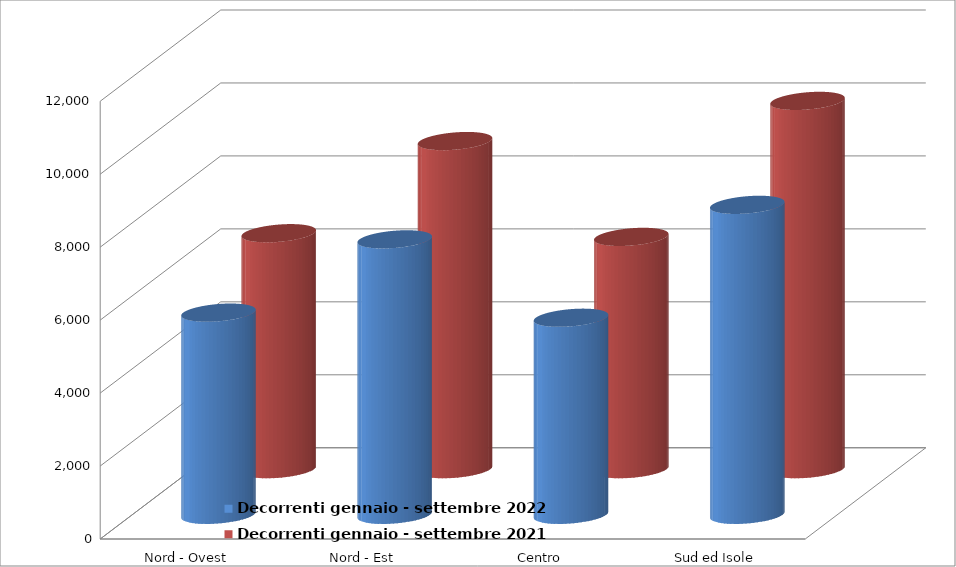
| Category | Decorrenti gennaio - settembre 2022 | Decorrenti gennaio - settembre 2021 |
|---|---|---|
| Nord - Ovest | 5542 | 6469 |
| Nord - Est | 7551 | 8995 |
| Centro | 5402 | 6368 |
| Sud ed Isole | 8497 | 10096 |